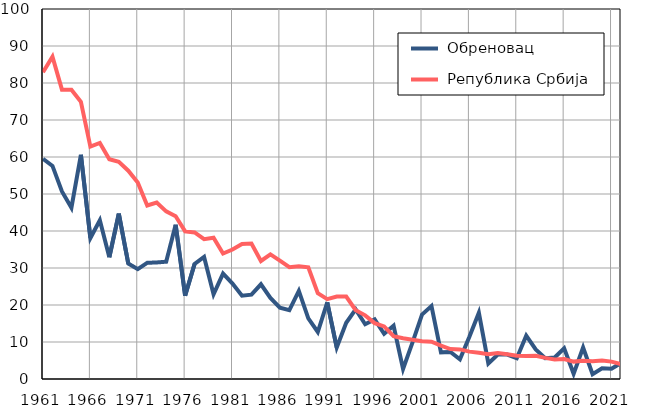
| Category |  Обреновац |  Република Србија |
|---|---|---|
| 1961.0 | 59.5 | 82.9 |
| 1962.0 | 57.6 | 87.1 |
| 1963.0 | 50.7 | 78.2 |
| 1964.0 | 46.3 | 78.2 |
| 1965.0 | 60.6 | 74.9 |
| 1966.0 | 38.1 | 62.8 |
| 1967.0 | 42.9 | 63.8 |
| 1968.0 | 32.9 | 59.4 |
| 1969.0 | 44.7 | 58.7 |
| 1970.0 | 31.2 | 56.3 |
| 1971.0 | 29.7 | 53.1 |
| 1972.0 | 31.4 | 46.9 |
| 1973.0 | 31.5 | 47.7 |
| 1974.0 | 31.7 | 45.3 |
| 1975.0 | 41.7 | 44 |
| 1976.0 | 22.5 | 39.9 |
| 1977.0 | 31.1 | 39.6 |
| 1978.0 | 33 | 37.8 |
| 1979.0 | 22.9 | 38.2 |
| 1980.0 | 28.5 | 33.9 |
| 1981.0 | 25.8 | 35 |
| 1982.0 | 22.5 | 36.5 |
| 1983.0 | 22.8 | 36.6 |
| 1984.0 | 25.6 | 31.9 |
| 1985.0 | 21.9 | 33.7 |
| 1986.0 | 19.3 | 32 |
| 1987.0 | 18.6 | 30.2 |
| 1988.0 | 23.8 | 30.5 |
| 1989.0 | 16.4 | 30.2 |
| 1990.0 | 12.7 | 23.2 |
| 1991.0 | 20.7 | 21.6 |
| 1992.0 | 8.5 | 22.3 |
| 1993.0 | 15.2 | 22.3 |
| 1994.0 | 18.8 | 18.6 |
| 1995.0 | 14.8 | 17.2 |
| 1996.0 | 16.1 | 15.1 |
| 1997.0 | 12.2 | 14.2 |
| 1998.0 | 14.4 | 11.6 |
| 1999.0 | 2.7 | 11 |
| 2000.0 | 9.9 | 10.6 |
| 2001.0 | 17.4 | 10.2 |
| 2002.0 | 19.7 | 10.1 |
| 2003.0 | 7.2 | 9 |
| 2004.0 | 7.3 | 8.1 |
| 2005.0 | 5.3 | 8 |
| 2006.0 | 11.4 | 7.4 |
| 2007.0 | 17.9 | 7.1 |
| 2008.0 | 4.2 | 6.7 |
| 2009.0 | 6.6 | 7 |
| 2010.0 | 6.6 | 6.7 |
| 2011.0 | 5.6 | 6.3 |
| 2012.0 | 11.7 | 6.2 |
| 2013.0 | 8 | 6.3 |
| 2014.0 | 5.6 | 5.7 |
| 2015.0 | 5.8 | 5.3 |
| 2016.0 | 8.3 | 5.4 |
| 2017.0 | 1.4 | 4.7 |
| 2018.0 | 8.5 | 4.9 |
| 2019.0 | 1.3 | 4.8 |
| 2020.0 | 2.9 | 5 |
| 2021.0 | 2.8 | 4.7 |
| 2022.0 | 4.3 | 4 |